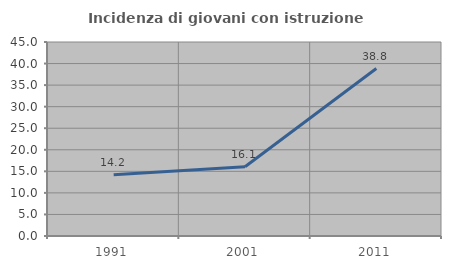
| Category | Incidenza di giovani con istruzione universitaria |
|---|---|
| 1991.0 | 14.216 |
| 2001.0 | 16.062 |
| 2011.0 | 38.843 |